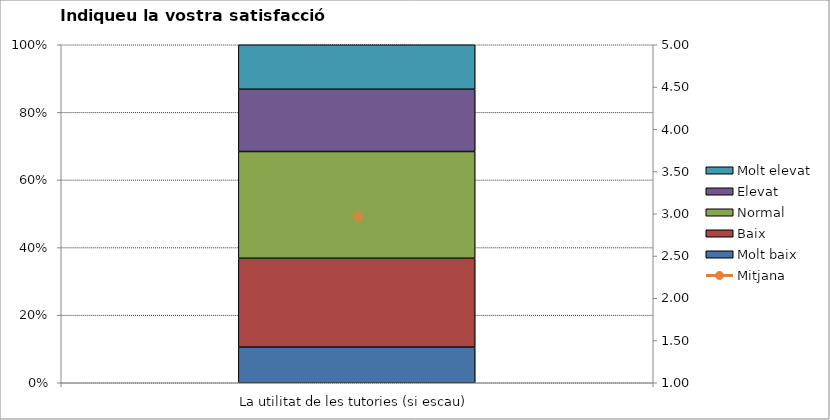
| Category | Molt baix | Baix | Normal  | Elevat | Molt elevat |
|---|---|---|---|---|---|
| La utilitat de les tutories (si escau) | 4 | 10 | 12 | 7 | 5 |